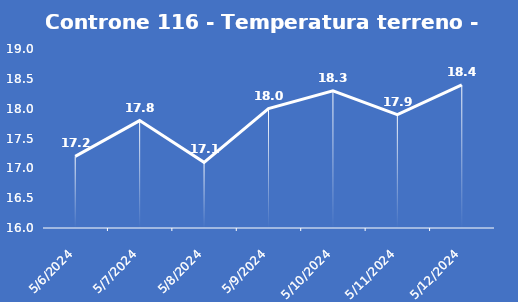
| Category | Controne 116 - Temperatura terreno - Grezzo (°C) |
|---|---|
| 5/6/24 | 17.2 |
| 5/7/24 | 17.8 |
| 5/8/24 | 17.1 |
| 5/9/24 | 18 |
| 5/10/24 | 18.3 |
| 5/11/24 | 17.9 |
| 5/12/24 | 18.4 |